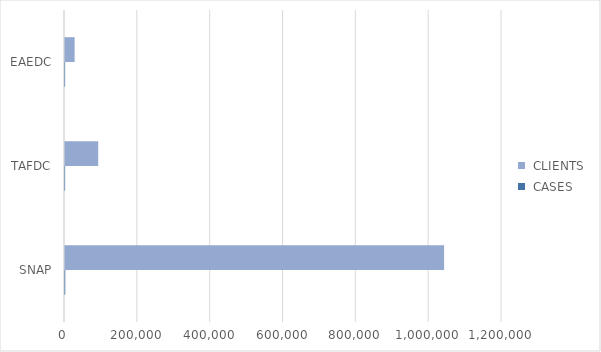
| Category |  CASES |  CLIENTS |
|---|---|---|
| SNAP | 758 | 1041011 |
| TAFDC | 336 | 91208 |
| EAEDC | 312 | 26389 |